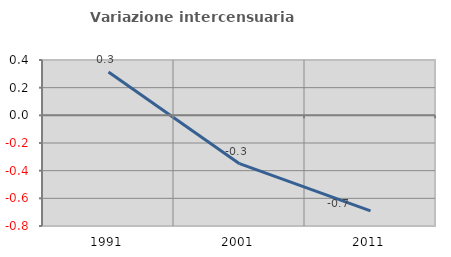
| Category | Variazione intercensuaria annua |
|---|---|
| 1991.0 | 0.313 |
| 2001.0 | -0.349 |
| 2011.0 | -0.69 |